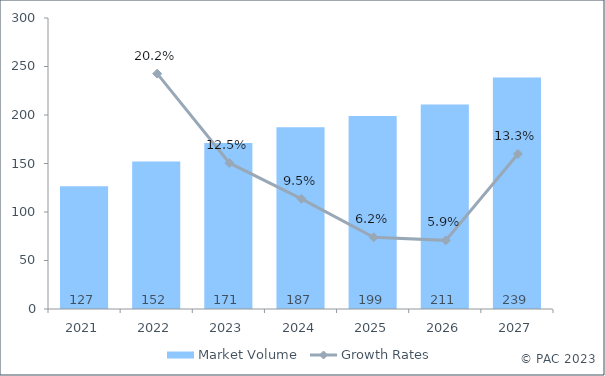
| Category | Market Volume |
|---|---|
| 2021.0 | 126.557 |
| 2022.0 | 152.144 |
| 2023.0 | 171.233 |
| 2024.0 | 187.441 |
| 2025.0 | 198.978 |
| 2026.0 | 210.711 |
| 2027.0 | 238.78 |